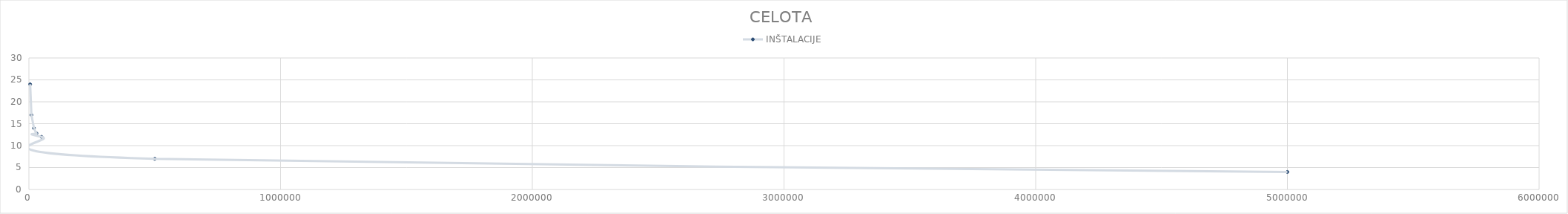
| Category | INŠTALACIJE |
|---|---|
| nan | 0 |
| 5000.0 | 24 |
| 10000.0 | 17 |
| 20000.0 | 14 |
| 30000.0 | 12.8 |
| 50000.0 | 12 |
| 500000.0 | 7 |
| 5000000.0 | 4 |